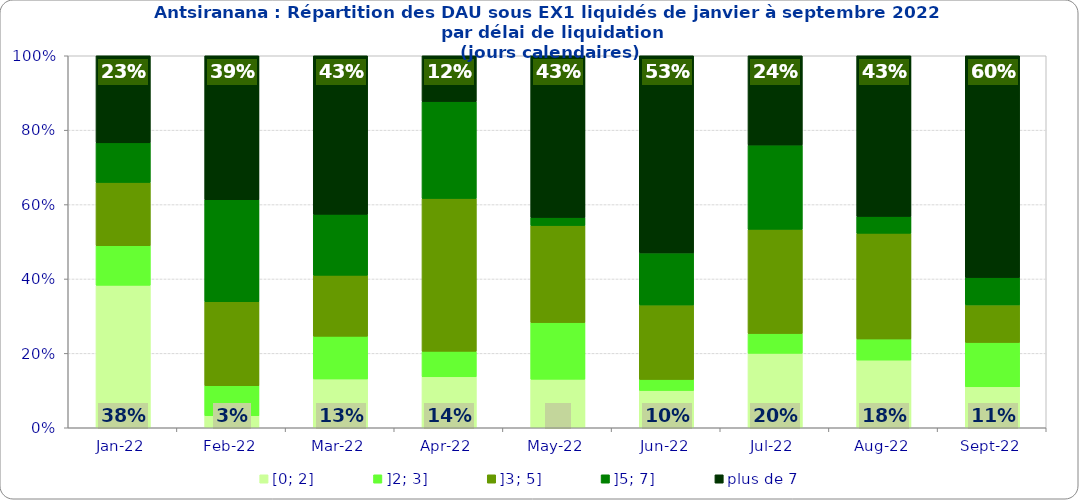
| Category | [0; 2] | ]2; 3] | ]3; 5] | ]5; 7] | plus de 7 |
|---|---|---|---|---|---|
| 2022-01-01 | 0.383 | 0.106 | 0.17 | 0.106 | 0.234 |
| 2022-02-01 | 0.032 | 0.081 | 0.226 | 0.274 | 0.387 |
| 2022-03-01 | 0.131 | 0.115 | 0.164 | 0.164 | 0.426 |
| 2022-04-01 | 0.137 | 0.068 | 0.411 | 0.26 | 0.123 |
| 2022-05-01 | 0.13 | 0.152 | 0.261 | 0.022 | 0.435 |
| 2022-06-01 | 0.1 | 0.03 | 0.2 | 0.14 | 0.53 |
| 2022-07-01 | 0.2 | 0.053 | 0.28 | 0.227 | 0.24 |
| 2022-08-01 | 0.182 | 0.057 | 0.284 | 0.045 | 0.432 |
| 2022-09-01 | 0.11 | 0.119 | 0.101 | 0.073 | 0.596 |